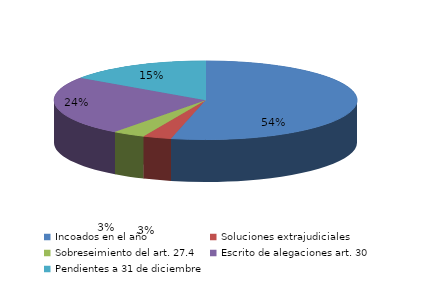
| Category | Series 0 |
|---|---|
| Incoados en el año | 353 |
| Soluciones extrajudiciales | 20 |
| Sobreseimiento del art. 27.4 | 23 |
| Escrito de alegaciones art. 30 | 161 |
| Pendientes a 31 de diciembre | 101 |